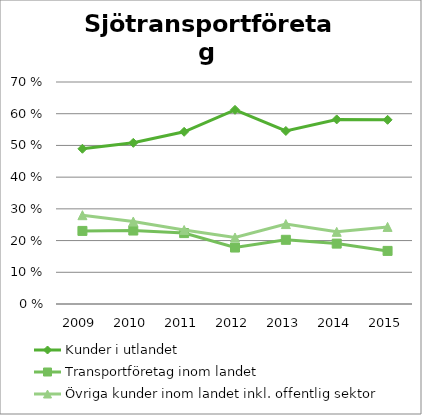
| Category | Kunder i utlandet | Transportföretag inom landet | Övriga kunder inom landet inkl. offentlig sektor |
|---|---|---|---|
| 2009.0 | 0.49 | 0.23 | 0.28 |
| 2010.0 | 0.508 | 0.232 | 0.26 |
| 2011.0 | 0.543 | 0.224 | 0.233 |
| 2012.0 | 0.612 | 0.178 | 0.21 |
| 2013.0 | 0.546 | 0.202 | 0.252 |
| 2014.0 | 0.582 | 0.19 | 0.228 |
| 2015.0 | 0.581 | 0.167 | 0.243 |